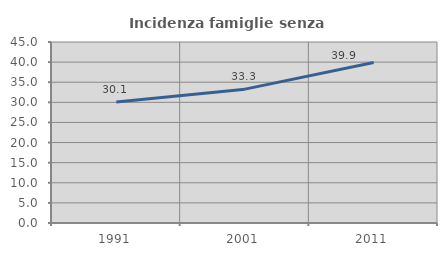
| Category | Incidenza famiglie senza nuclei |
|---|---|
| 1991.0 | 30.074 |
| 2001.0 | 33.276 |
| 2011.0 | 39.903 |